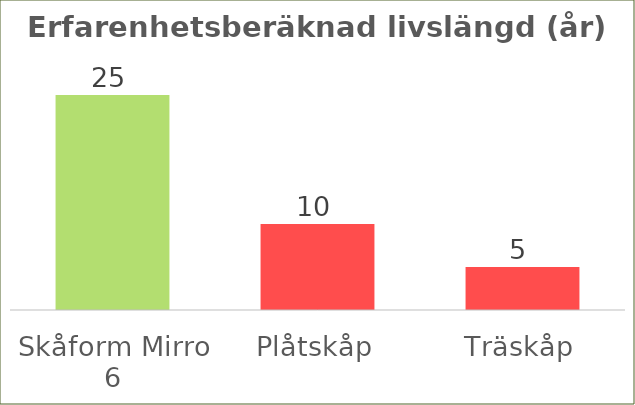
| Category | Erfarenhetsberäknad livslängd (år) |
|---|---|
| Skåform Mirro 6 | 25 |
| Plåtskåp | 10 |
| Träskåp | 5 |